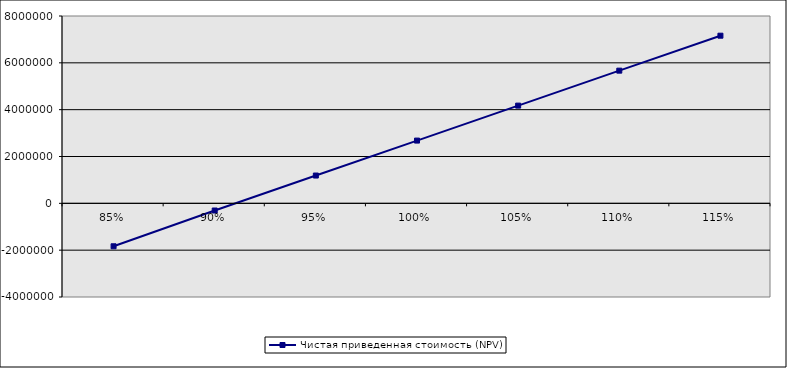
| Category | Чистая приведенная стоимость (NPV) |
|---|---|
| 0.85 | -1833899.857 |
| 0.9 | -306210.145 |
| 0.9500000000000001 | 1186831.577 |
| 1.0 | 2679873.299 |
| 1.05 | 4172915.021 |
| 1.1 | 5665956.743 |
| 1.1500000000000001 | 7158998.464 |